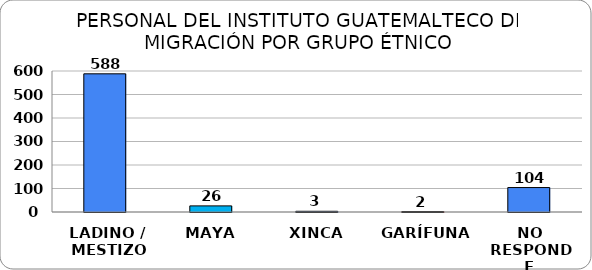
| Category | Series 0 |
|---|---|
| LADINO /
 MESTIZO | 588 |
| MAYA | 26 |
| XINCA | 3 |
| GARÍFUNA | 2 |
| NO RESPONDE | 104 |